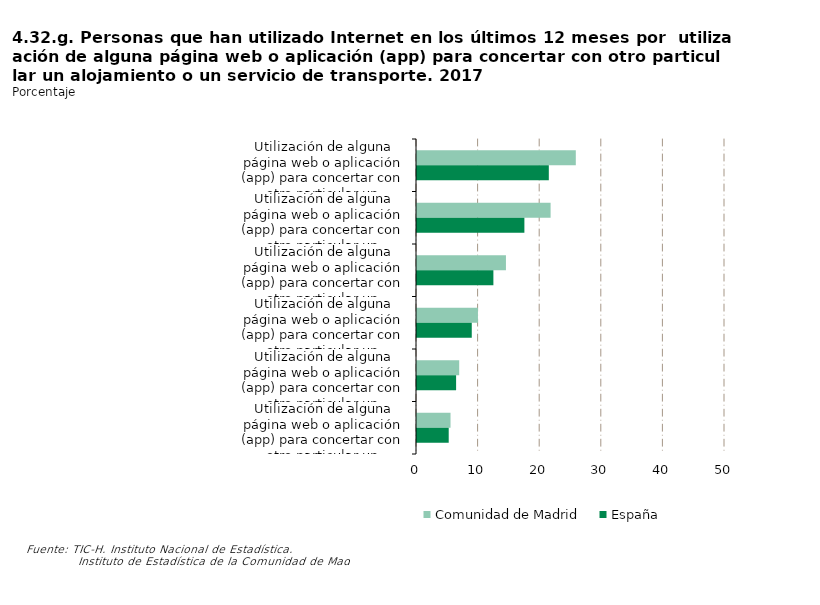
| Category | Comunidad de Madrid | España |
|---|---|---|
| Utilización de alguna página web o aplicación (app) para concertar con otro particular un alojamiento: Cualquier tipo de páginas web o apps | 25.779 | 21.398 |
| Utilización de alguna página web o aplicación (app) para concertar con otro particular un alojamiento: Páginas web o apps especializadas en el tema | 21.688 | 17.433 |
| Utilización de alguna página web o aplicación (app) para concertar con otro particular un alojamiento: Otras páginas web o apps (incluidas redes sociales) | 14.44 | 12.401 |
| Utilización de alguna página web o aplicación (app) para concertar con otro particular un servicio de transporte: Cualquier tipo de páginas web o apps | 9.895 | 8.89 |
| Utilización de alguna página web o aplicación (app) para concertar con otro particular un servicio de transporte: Páginas web o apps especializadas en el tema | 6.852 | 6.348 |
| Utilización de alguna página web o aplicación (app) para concertar con otro particular un servicio de transporte: Otras páginas web o apps (incluidas redes sociales) | 5.441 | 5.148 |